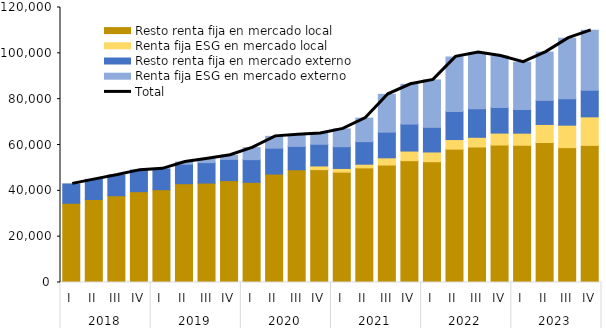
| Category | Resto renta fija en mercado local | Renta fija ESG en mercado local | Resto renta fija en mercado externo | Renta fija ESG en mercado externo |
|---|---|---|---|---|
| 0 | 34569.052 | 0 | 8458.116 | 0 |
| 1 | 36206.414 | 0 | 8789.8 | 0 |
| 2 | 37870.143 | 0 | 9000.144 | 0 |
| 3 | 39630.095 | 0 | 9398.295 | 0 |
| 4 | 40499.797 | 0 | 9099.034 | 0 |
| 5 | 43117.55 | 0 | 8492.145 | 967.097 |
| 6 | 43391.716 | 0 | 8908.401 | 1726.623 |
| 7 | 44466.717 | 0 | 9252.422 | 1797.298 |
| 8 | 43704.947 | 0 | 9909.414 | 5258.162 |
| 9 | 47318.233 | 0 | 11307.939 | 5146.389 |
| 10 | 49201.911 | 0 | 10198.1 | 5036.29 |
| 11 | 49255.301 | 1609.782 | 9454.35 | 4691.349 |
| 12 | 48144.166 | 1619.515 | 9497.81 | 7771.21 |
| 13 | 50010.575 | 1609.674 | 9835.534 | 10276.365 |
| 14 | 51248.983 | 3156.564 | 11207.079 | 16498.9 |
| 15 | 53165.079 | 4194.067 | 11762.07 | 17366.899 |
| 16 | 52708.631 | 4237.1 | 10762.082 | 20699.488 |
| 17 | 58187.092 | 4193.592 | 12197.567 | 23874.104 |
| 18 | 59120.993 | 4237.581 | 12433.395 | 24594.439 |
| 19 | 59991.129 | 5205.251 | 11172.843 | 22439.256 |
| 20 | 59895.639 | 5265.295 | 10320.72 | 20652.631 |
| 21 | 61076.323 | 7893.125 | 10493.86 | 21074.955 |
| 22 | 58864.895 | 9782.325 | 11512.217 | 26445.011 |
| 23 | 59834.389 | 12446.145 | 11576.091 | 26181.958 |